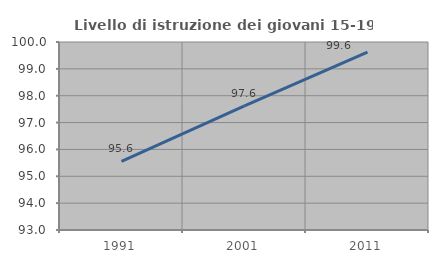
| Category | Livello di istruzione dei giovani 15-19 anni |
|---|---|
| 1991.0 | 95.556 |
| 2001.0 | 97.619 |
| 2011.0 | 99.624 |